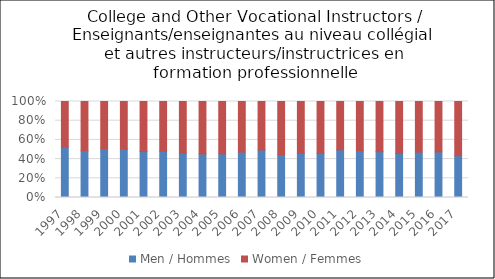
| Category | Men / Hommes | Women / Femmes |
|---|---|---|
| 1997.0 | 0.525 | 0.475 |
| 1998.0 | 0.487 | 0.513 |
| 1999.0 | 0.508 | 0.492 |
| 2000.0 | 0.504 | 0.496 |
| 2001.0 | 0.479 | 0.521 |
| 2002.0 | 0.48 | 0.52 |
| 2003.0 | 0.462 | 0.538 |
| 2004.0 | 0.453 | 0.547 |
| 2005.0 | 0.455 | 0.545 |
| 2006.0 | 0.474 | 0.526 |
| 2007.0 | 0.494 | 0.506 |
| 2008.0 | 0.446 | 0.554 |
| 2009.0 | 0.46 | 0.54 |
| 2010.0 | 0.46 | 0.54 |
| 2011.0 | 0.497 | 0.503 |
| 2012.0 | 0.488 | 0.512 |
| 2013.0 | 0.477 | 0.523 |
| 2014.0 | 0.458 | 0.542 |
| 2015.0 | 0.472 | 0.528 |
| 2016.0 | 0.475 | 0.525 |
| 2017.0 | 0.435 | 0.565 |